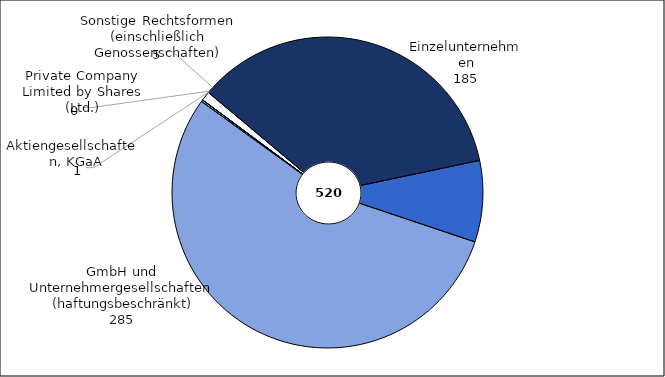
| Category | Series 0 |
|---|---|
| Einzelunternehmen | 185 |
| Personengesellschaften (OHG, KG, GbR) | 44 |
| Gesellschaften m.b.H. (einschließlich Unternehmergesellschaften (haftungsbeschränkt)) | 285 |
| Aktiengesellschaften, KGaA | 1 |
| Private Company Limited by Shares (Ltd.) | 0 |
| Sonstige Rechtsformen (einschließlich Genossenschaften) | 5 |